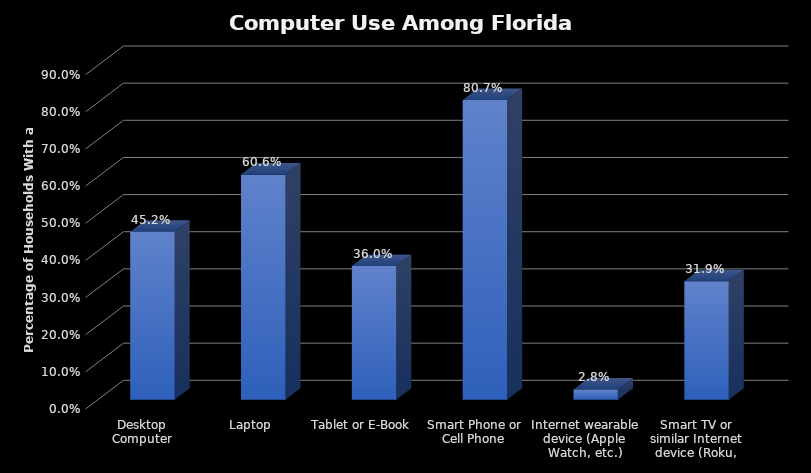
| Category | Series 0 |
|---|---|
| Desktop Computer | 0.452 |
| Laptop | 0.606 |
| Tablet or E-Book | 0.36 |
| Smart Phone or Cell Phone | 0.807 |
| Internet wearable device (Apple Watch, etc.) | 0.028 |
| Smart TV or similar Internet device (Roku, Xbox, etc.) | 0.319 |